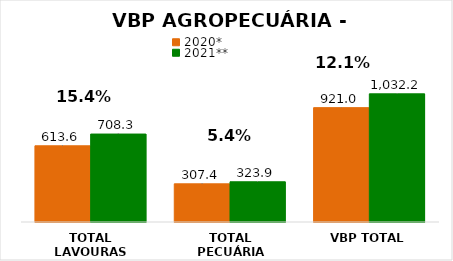
| Category | 2020* | 2021** |
|---|---|---|
| TOTAL LAVOURAS | 613.606 | 708.338 |
| TOTAL PECUÁRIA | 307.383 | 323.885 |
| VBP TOTAL | 920.989 | 1032.223 |